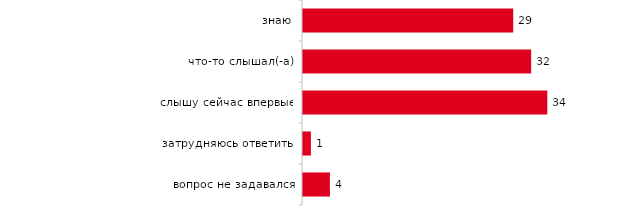
| Category | Series 0 |
|---|---|
| знаю | 29.3 |
| что-то слышал(-а) | 31.8 |
| слышу сейчас впервые | 34.05 |
| затрудняюсь ответить | 1.1 |
| вопрос не задавался | 3.75 |